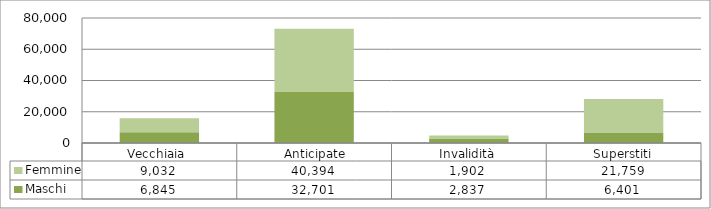
| Category | Maschi | Femmine |
|---|---|---|
| Vecchiaia  | 6845 | 9032 |
|  Anticipate | 32701 | 40394 |
| Invalidità | 2837 | 1902 |
| Superstiti | 6401 | 21759 |